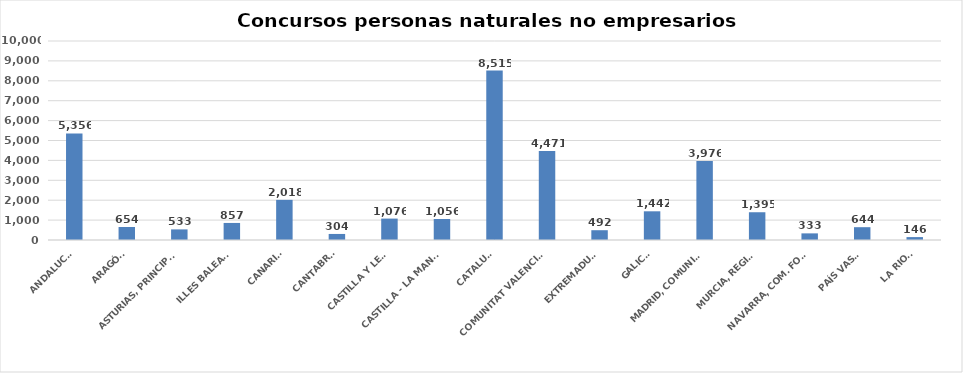
| Category | Series 0 |
|---|---|
| ANDALUCÍA | 5356 |
| ARAGÓN | 654 |
| ASTURIAS, PRINCIPADO | 533 |
| ILLES BALEARS | 857 |
| CANARIAS | 2018 |
| CANTABRIA | 304 |
| CASTILLA Y LEÓN | 1076 |
| CASTILLA - LA MANCHA | 1056 |
| CATALUÑA | 8515 |
| COMUNITAT VALENCIANA | 4471 |
| EXTREMADURA | 492 |
| GALICIA | 1442 |
| MADRID, COMUNIDAD | 3976 |
| MURCIA, REGIÓN | 1395 |
| NAVARRA, COM. FORAL | 333 |
| PAÍS VASCO | 644 |
| LA RIOJA | 146 |